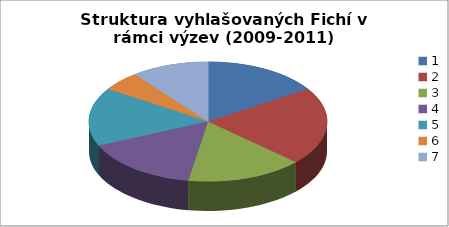
| Category | Struktura vyhlašovaných Fichí v rámci výzev (2009-2011) |
|---|---|
| 0 | 3 |
| 1 | 4 |
| 2 | 3 |
| 3 | 3 |
| 4 | 3 |
| 5 | 1 |
| 6 | 2 |